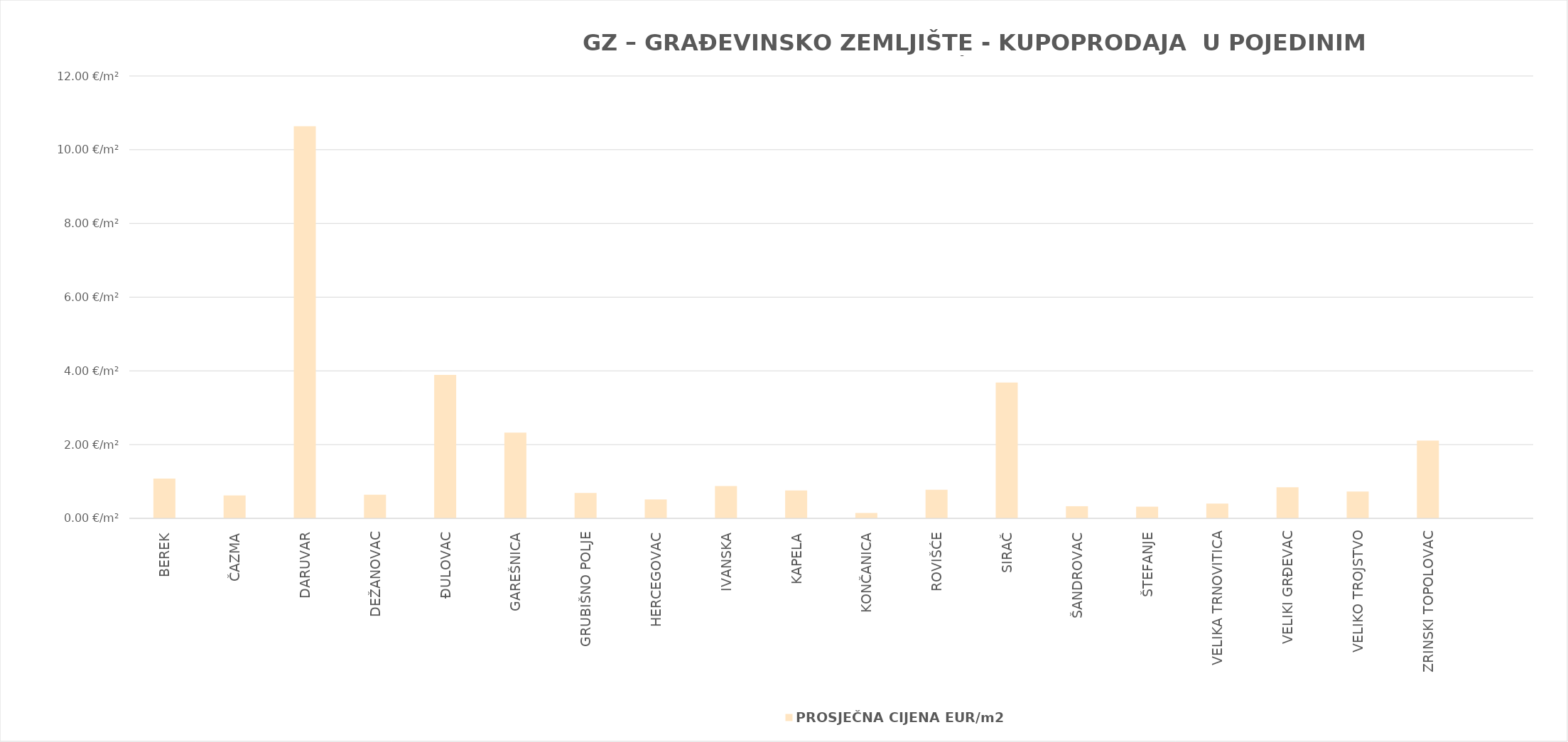
| Category | PROSJEČNA CIJENA EUR/m2 |
|---|---|
| BEREK | 1900-01-01 01:52:51 |
| ČAZMA | 0.622 |
| DARUVAR | 1900-01-10 15:16:54 |
| DEŽANOVAC | 0.64 |
| ĐULOVAC | 1900-01-03 21:22:39 |
| GAREŠNICA | 1900-01-02 07:50:28 |
| GRUBIŠNO POLJE | 0.69 |
| HERCEGOVAC | 0.513 |
| IVANSKA | 0.878 |
| KAPELA | 0.757 |
| KONČANICA | 0.145 |
| ROVIŠĆE | 0.776 |
| SIRAČ | 1900-01-03 16:27:31 |
| ŠANDROVAC | 0.328 |
| ŠTEFANJE | 0.316 |
| VELIKA TRNOVITICA | 0.4 |
| VELIKI GRĐEVAC | 0.843 |
| VELIKO TROJSTVO | 0.726 |
| ZRINSKI TOPOLOVAC | 1900-01-02 02:37:16 |